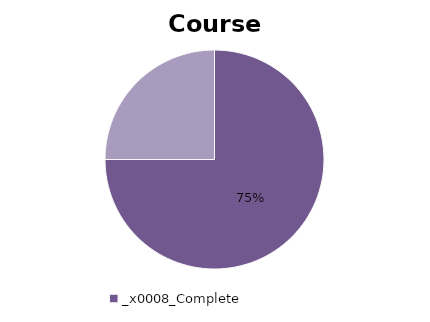
| Category | Series 0 |
|---|---|
| 0 | 42 |
| 1 | 14 |